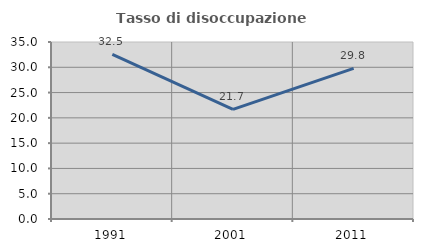
| Category | Tasso di disoccupazione giovanile  |
|---|---|
| 1991.0 | 32.534 |
| 2001.0 | 21.685 |
| 2011.0 | 29.77 |